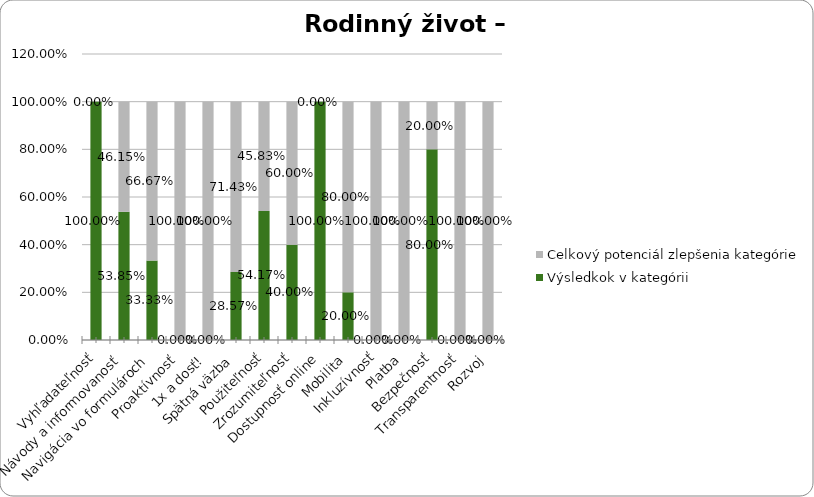
| Category | Výsledkok v kategórii | Celkový potenciál zlepšenia kategórie |
|---|---|---|
| Vyhľadateľnosť | 1 | 0 |
| Návody a informovanosť | 0.538 | 0.462 |
| Navigácia vo formulároch | 0.333 | 0.667 |
| Proaktívnosť | 0 | 1 |
| 1x a dosť! | 0 | 1 |
| Spätná väzba | 0.286 | 0.714 |
| Použiteľnosť | 0.542 | 0.458 |
| Zrozumiteľnosť | 0.4 | 0.6 |
| Dostupnosť online | 1 | 0 |
| Mobilita | 0.2 | 0.8 |
| Inkluzívnosť | 0 | 1 |
| Platba | 0 | 1 |
| Bezpečnosť | 0.8 | 0.2 |
| Transparentnosť | 0 | 1 |
| Rozvoj | 0 | 1 |